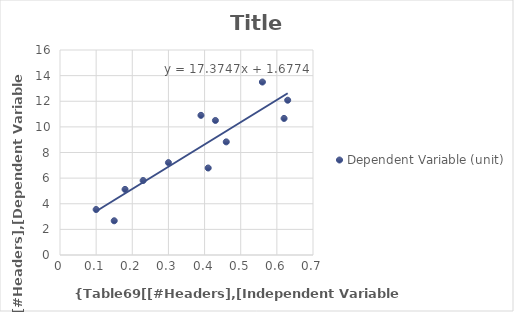
| Category | Dependent Variable (unit) |
|---|---|
| 0.3 | 7.21 |
| 0.18 | 5.12 |
| 0.46 | 8.83 |
| 0.63 | 12.08 |
| 0.23 | 5.81 |
| 0.56 | 13.5 |
| 0.39 | 10.9 |
| 0.41 | 6.79 |
| 0.62 | 10.66 |
| 0.43 | 10.5 |
| 0.15 | 2.67 |
| 0.1 | 3.55 |